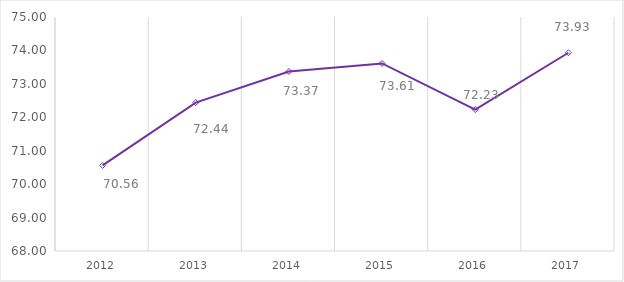
| Category | Series 0 |
|---|---|
| 2012.0 | 70.56 |
| 2013.0 | 72.44 |
| 2014.0 | 73.37 |
| 2015.0 | 73.61 |
| 2016.0 | 72.23 |
| 2017.0 | 73.93 |